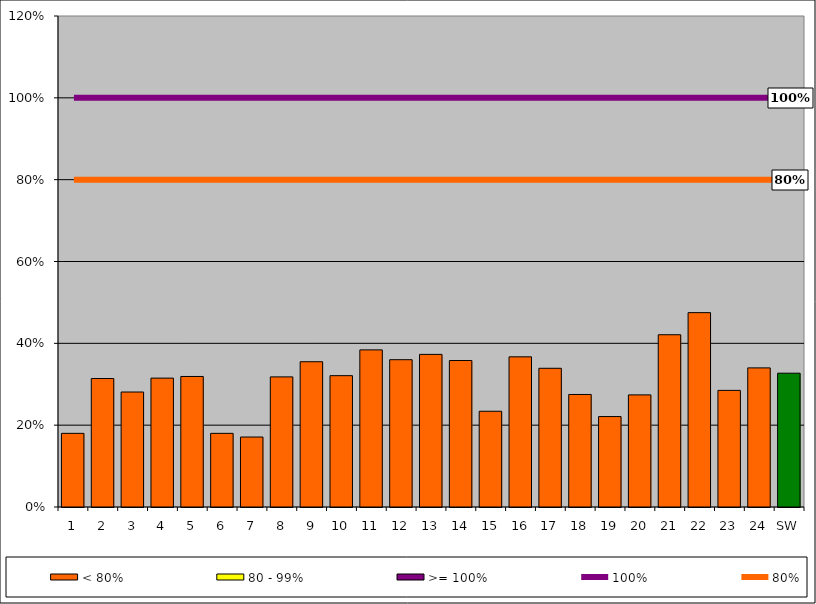
| Category | < 80% | 80 - 99% | >= 100% |
|---|---|---|---|
| 1 | 0.18 | 0 | 0 |
| 2 | 0.314 | 0 | 0 |
| 3 | 0.281 | 0 | 0 |
| 4 | 0.315 | 0 | 0 |
| 5 | 0.319 | 0 | 0 |
| 6 | 0.18 | 0 | 0 |
| 7 | 0.171 | 0 | 0 |
| 8 | 0.318 | 0 | 0 |
| 9 | 0.355 | 0 | 0 |
| 10 | 0.321 | 0 | 0 |
| 11 | 0.384 | 0 | 0 |
| 12 | 0.36 | 0 | 0 |
| 13 | 0.373 | 0 | 0 |
| 14 | 0.358 | 0 | 0 |
| 15 | 0.234 | 0 | 0 |
| 16 | 0.367 | 0 | 0 |
| 17 | 0.339 | 0 | 0 |
| 18 | 0.275 | 0 | 0 |
| 19 | 0.221 | 0 | 0 |
| 20 | 0.274 | 0 | 0 |
| 21 | 0.421 | 0 | 0 |
| 22 | 0.475 | 0 | 0 |
| 23 | 0.285 | 0 | 0 |
| 24 | 0.34 | 0 | 0 |
| SW | 0.327 | 0 | 0 |